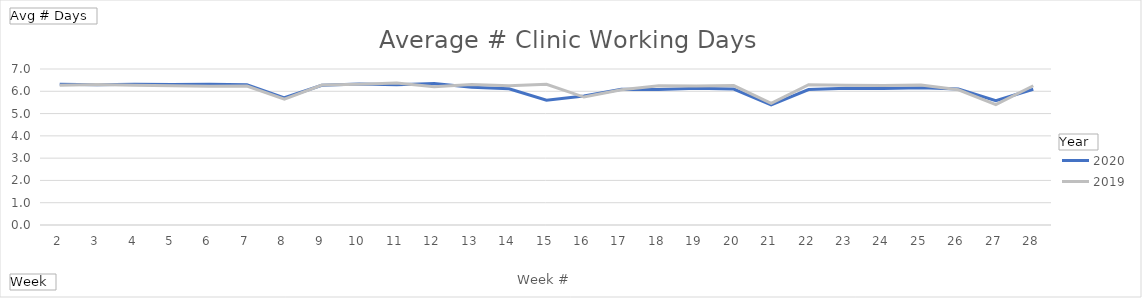
| Category | 2020 | 2019 |
|---|---|---|
| 2 | 6.315 | 6.27 |
| 3 | 6.292 | 6.303 |
| 4 | 6.315 | 6.27 |
| 5 | 6.303 | 6.247 |
| 6 | 6.315 | 6.225 |
| 7 | 6.292 | 6.236 |
| 8 | 5.708 | 5.652 |
| 9 | 6.27 | 6.281 |
| 10 | 6.326 | 6.315 |
| 11 | 6.292 | 6.371 |
| 12 | 6.348 | 6.202 |
| 13 | 6.18 | 6.303 |
| 14 | 6.112 | 6.247 |
| 15 | 5.596 | 6.315 |
| 16 | 5.787 | 5.742 |
| 17 | 6.09 | 6.067 |
| 18 | 6.079 | 6.247 |
| 19 | 6.135 | 6.236 |
| 20 | 6.101 | 6.258 |
| 21 | 5.393 | 5.461 |
| 22 | 6.079 | 6.292 |
| 23 | 6.135 | 6.27 |
| 24 | 6.124 | 6.258 |
| 25 | 6.157 | 6.281 |
| 26 | 6.101 | 6.067 |
| 27 | 5.573 | 5.404 |
| 28 | 6.09 | 6.247 |